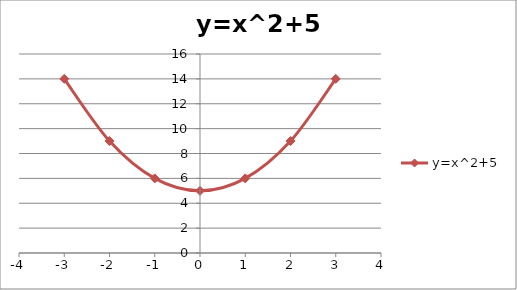
| Category | y=x^2+5 |
|---|---|
| -3.0 | 14 |
| -2.0 | 9 |
| -1.0 | 6 |
| 0.0 | 5 |
| 1.0 | 6 |
| 2.0 | 9 |
| 3.0 | 14 |